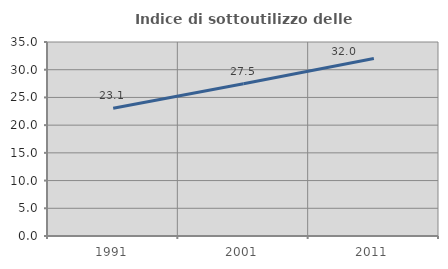
| Category | Indice di sottoutilizzo delle abitazioni  |
|---|---|
| 1991.0 | 23.056 |
| 2001.0 | 27.483 |
| 2011.0 | 32.008 |